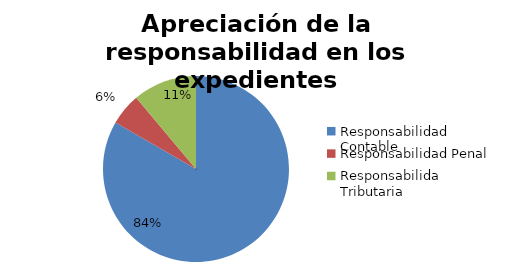
| Category | Series 0 |
|---|---|
| Responsabilidad Contable | 15 |
| Responsabilidad Penal | 1 |
| Responsabilida Tributaria | 2 |